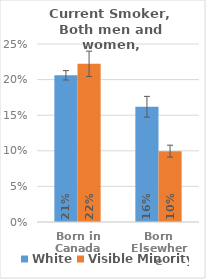
| Category | White | Visible Minority |
|---|---|---|
| Born in Canada | 0.206 | 0.222 |
| Born Elsewhere | 0.162 | 0.1 |